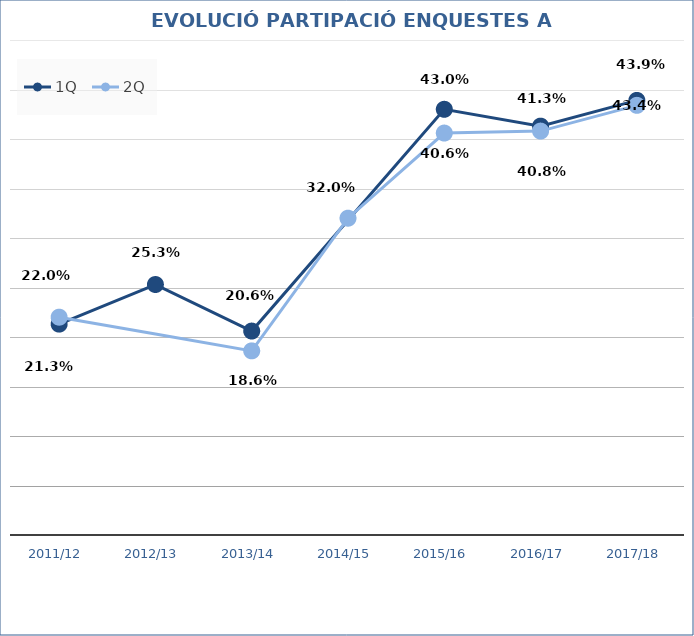
| Category | 1Q | 2Q |
|---|---|---|
| 2011/12 | 0.213 | 0.22 |
| 2012/13 | 0.253 | 0.203 |
| 2013/14 | 0.206 | 0.186 |
| 2014/15 | 0.318 | 0.32 |
| 2015/16 | 0.43 | 0.406 |
| 2016/17 | 0.413 | 0.408 |
| 2017/18 | 0.439 | 0.434 |